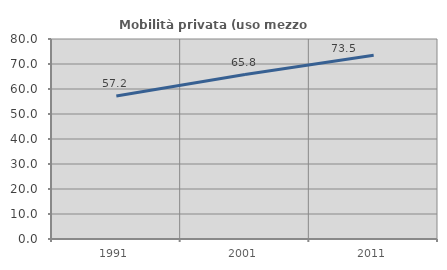
| Category | Mobilità privata (uso mezzo privato) |
|---|---|
| 1991.0 | 57.162 |
| 2001.0 | 65.796 |
| 2011.0 | 73.524 |